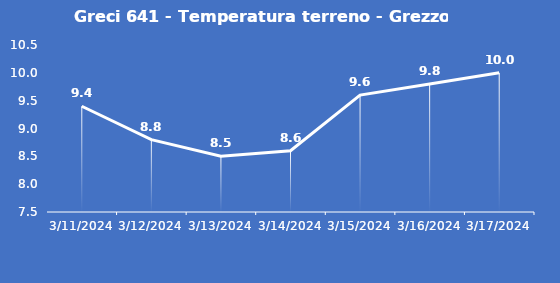
| Category | Greci 641 - Temperatura terreno - Grezzo (°C) |
|---|---|
| 3/11/24 | 9.4 |
| 3/12/24 | 8.8 |
| 3/13/24 | 8.5 |
| 3/14/24 | 8.6 |
| 3/15/24 | 9.6 |
| 3/16/24 | 9.8 |
| 3/17/24 | 10 |